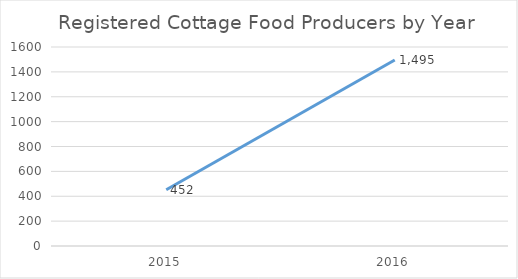
| Category | Series 0 |
|---|---|
| 2015.0 | 452 |
| 2016.0 | 1495 |